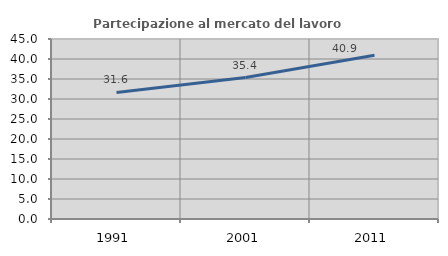
| Category | Partecipazione al mercato del lavoro  femminile |
|---|---|
| 1991.0 | 31.637 |
| 2001.0 | 35.358 |
| 2011.0 | 40.93 |